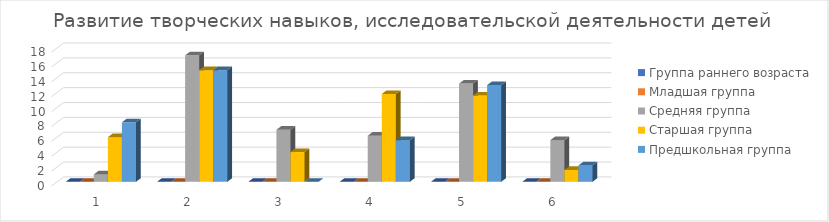
| Category | Группа раннего возраста | Младшая группа | Средняя группа | Старшая группа | Предшкольная группа |
|---|---|---|---|---|---|
| 0 | 0 | 0 | 1 | 6 | 8 |
| 1 | 0 | 0 | 17 | 15 | 15 |
| 2 | 0 | 0 | 7 | 4 | 0 |
| 3 | 0 | 0 | 6.2 | 11.8 | 5.6 |
| 4 | 0 | 0 | 13.2 | 11.6 | 13 |
| 5 | 0 | 0 | 5.6 | 1.6 | 2.2 |